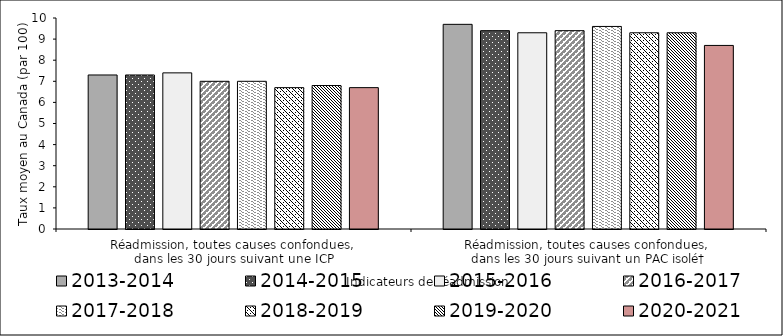
| Category | 2013-2014 | 2014-2015 | 2015-2016 | 2016-2017 | 2017-2018 | 2018-2019 | 2019-2020 | 2020-2021 |
|---|---|---|---|---|---|---|---|---|
| Réadmission, toutes causes confondues, 
dans les 30 jours suivant une ICP | 7.3 | 7.3 | 7.4 | 7 | 7 | 6.7 | 6.8 | 6.7 |
| Réadmission, toutes causes confondues, 
dans les 30 jours suivant un PAC isolé† | 9.7 | 9.4 | 9.3 | 9.4 | 9.6 | 9.3 | 9.3 | 8.7 |